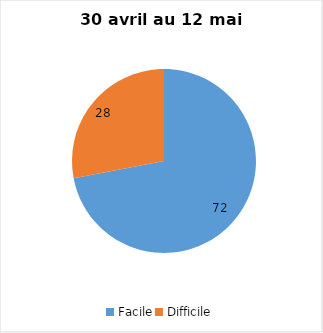
| Category | Series 0 |
|---|---|
| Facile | 72 |
| Difficile | 28 |